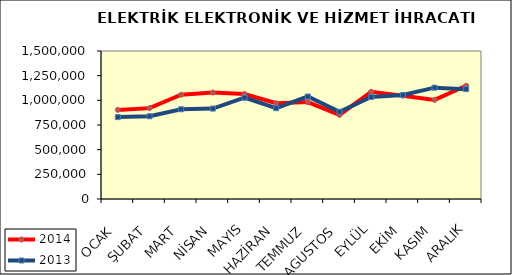
| Category | 2014 | 2013 |
|---|---|---|
| OCAK | 902952.549 | 830030.378 |
| ŞUBAT | 921008.483 | 838421.572 |
| MART | 1056528.793 | 909479.83 |
| NİSAN | 1079057.335 | 916370.573 |
| MAYIS | 1064518.966 | 1026528.406 |
| HAZİRAN | 970317.538 | 920031.073 |
| TEMMUZ | 982463.582 | 1038657.503 |
| AGUSTOS | 852365.018 | 884232.304 |
| EYLÜL | 1086347.975 | 1034166.587 |
| EKİM | 1046666.603 | 1054293.102 |
| KASIM | 1004594.778 | 1128425.091 |
| ARALIK | 1147585.729 | 1113474.417 |